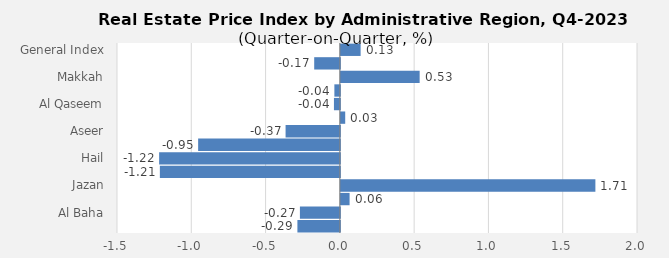
| Category | 2023 |
|---|---|
| General Index | 0.133 |
| Riyadh | -0.173 |
| Makkah | 0.53 |
| Madinah | -0.037 |
| Al Qaseem | -0.04 |
| Eastern Province | 0.029 |
| Aseer | -0.365 |
| Tabouk | -0.954 |
| Hail | -1.216 |
| Northern Borders | -1.211 |
| Jazan | 1.713 |
| Najran | 0.059 |
| Al Baha | -0.269 |
| Al Jouf | -0.286 |